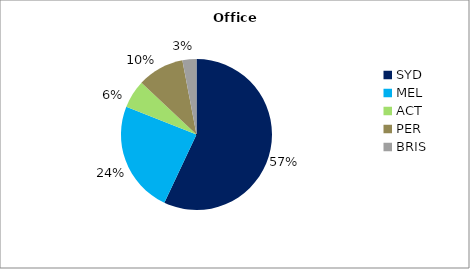
| Category | Series 0 |
|---|---|
| SYD | 0.57 |
| MEL | 0.24 |
| ACT | 0.06 |
| PER | 0.1 |
| BRIS | 0.03 |